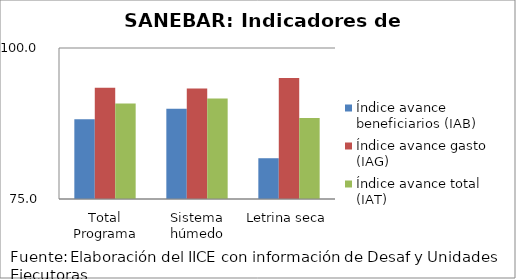
| Category | Índice avance beneficiarios (IAB)  | Índice avance gasto (IAG) | Índice avance total (IAT)  |
|---|---|---|---|
| Total Programa | 88.211 | 93.428 | 90.819 |
| Sistema húmedo | 89.933 | 93.306 | 91.62 |
| Letrina seca | 81.75 | 95.048 | 88.399 |